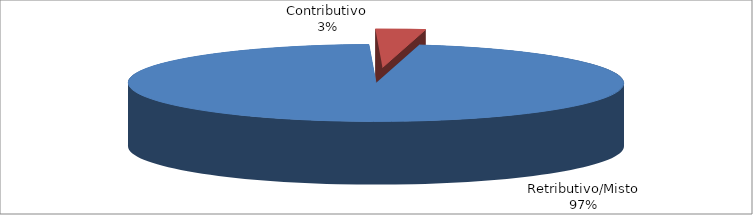
| Category | Decorrenti gennaio - settembre 2021 |
|---|---|
| Retributivo/Misto | 26118 |
| Contributivo | 874 |